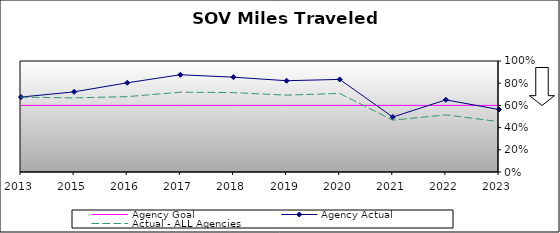
| Category | Agency Goal | Agency Actual | Actual - ALL Agencies |
|---|---|---|---|
| 2013.0 | 0.6 | 0.675 | 0.674 |
| 2015.0 | 0.6 | 0.722 | 0.668 |
| 2016.0 | 0.6 | 0.804 | 0.679 |
| 2017.0 | 0.6 | 0.876 | 0.719 |
| 2018.0 | 0.6 | 0.854 | 0.715 |
| 2019.0 | 0.6 | 0.822 | 0.692 |
| 2020.0 | 0.6 | 0.834 | 0.708 |
| 2021.0 | 0.6 | 0.495 | 0.467 |
| 2022.0 | 0.6 | 0.65 | 0.515 |
| 2023.0 | 0.6 | 0.563 | 0.454 |